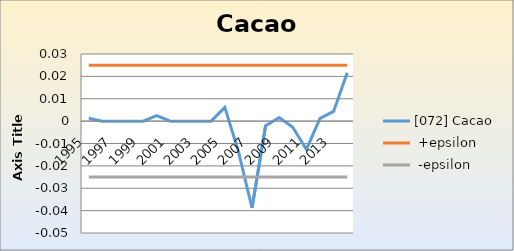
| Category | [072] Cacao |  +epsilon |  -epsilon |
|---|---|---|---|
| 1995.0 | 0.001 | 0.025 | -0.025 |
| 1996.0 | 0 | 0.025 | -0.025 |
| 1997.0 | 0 | 0.025 | -0.025 |
| 1998.0 | 0 | 0.025 | -0.025 |
| 1999.0 | 0 | 0.025 | -0.025 |
| 2000.0 | 0.002 | 0.025 | -0.025 |
| 2001.0 | 0 | 0.025 | -0.025 |
| 2002.0 | 0 | 0.025 | -0.025 |
| 2003.0 | 0 | 0.025 | -0.025 |
| 2004.0 | 0 | 0.025 | -0.025 |
| 2005.0 | 0.006 | 0.025 | -0.025 |
| 2006.0 | -0.014 | 0.025 | -0.025 |
| 2007.0 | -0.039 | 0.025 | -0.025 |
| 2008.0 | -0.002 | 0.025 | -0.025 |
| 2009.0 | 0.002 | 0.025 | -0.025 |
| 2010.0 | -0.003 | 0.025 | -0.025 |
| 2011.0 | -0.013 | 0.025 | -0.025 |
| 2012.0 | 0.001 | 0.025 | -0.025 |
| 2013.0 | 0.004 | 0.025 | -0.025 |
| 2014.0 | 0.022 | 0.025 | -0.025 |